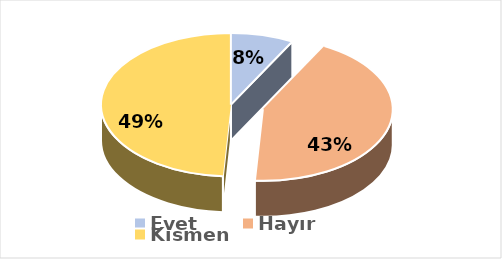
| Category | Evet |
|---|---|
| Evet | 0.078 |
| Hayır | 0.431 |
| Kısmen | 0.49 |